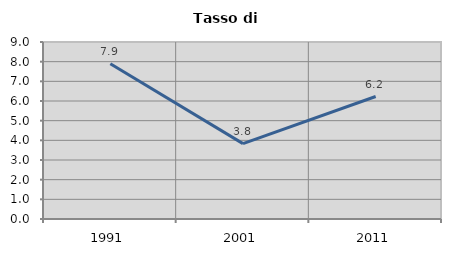
| Category | Tasso di disoccupazione   |
|---|---|
| 1991.0 | 7.895 |
| 2001.0 | 3.832 |
| 2011.0 | 6.228 |